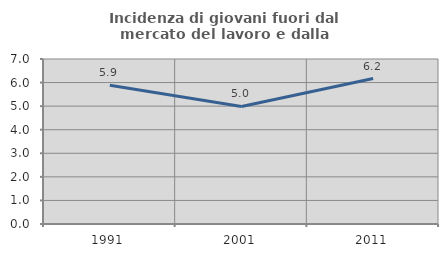
| Category | Incidenza di giovani fuori dal mercato del lavoro e dalla formazione  |
|---|---|
| 1991.0 | 5.886 |
| 2001.0 | 4.987 |
| 2011.0 | 6.172 |